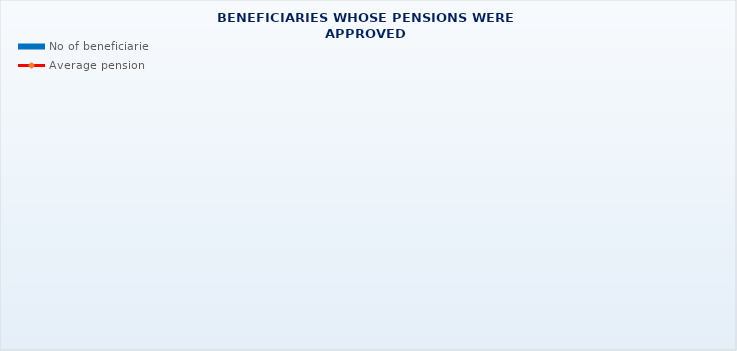
| Category | No of beneficiaries |
|---|---|
| Authorised officials in internal affairs, judicial officers and workers engaged in demining work: | 17264 |
| Pension beneficiaries entitled under the Fire Services Act (Official Gazette 125/19) | 233 |
| Active military personnel - DVO  | 15867 |
| Croatian Homeland Army veterans mobilised from 1941 to 1945 | 2547 |
| Former political prisoners | 2352 |
| Croatian Veterans from the Homeland War - ZOHBDR (Act on Croatian Homeland War Veterans and Their Family Members) | 70849 |
| Pensions approved under general regulations and determined according to the Act on the Rights of Croatian Homeland War Veterans and their Family Members (ZOHBDR), in 2017 (Art. 27, 35, 48 and 49, paragraph 2)    | 52295 |
| Former Yugoslav People's Army members - JNA   | 4287 |
| Former Yugoslav People's Army members - JNA - Art. 185 of Pension Insurance Act (ZOMO)  | 157 |
| National Liberation War veterans - NOR | 6444 |
| Members of the Croatian Parliament, members of the Government, judges of the Constitutional Court and the Auditor General | 682 |
| Members of the Parliamentary Executive Council and administratively retired federal civil servants  (relates to the former SFRY) | 74 |
| Former officials of federal bodies o the former SFRJ -  Article 38 of the Pension Insurance Act (ZOMO) | 24 |
| Full members of the Croatian Academy of Sciences and Arts - HAZU | 130 |
| Miners from the Istrian coal mines "Tupljak" d.d. Labin  | 248 |
| Workers professionally exposed to asbestos | 848 |
| Insurees - crew members on a ship in international and national navigation  - Article  129, paragraph 2 of the Maritime Code | 203 |
| Members of the Croatian Defence Council - HVO  | 6783 |